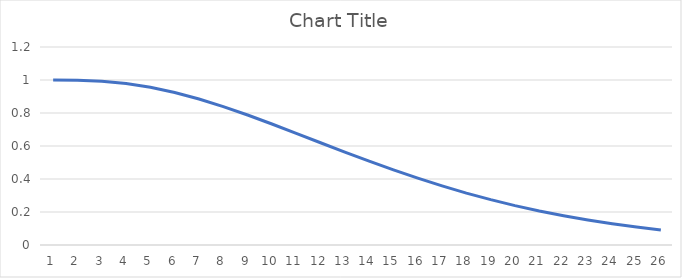
| Category | Series 0 |
|---|---|
| 0 | 1 |
| 1 | 0.999 |
| 2 | 0.993 |
| 3 | 0.979 |
| 4 | 0.956 |
| 5 | 0.925 |
| 6 | 0.885 |
| 7 | 0.839 |
| 8 | 0.788 |
| 9 | 0.733 |
| 10 | 0.677 |
| 11 | 0.62 |
| 12 | 0.563 |
| 13 | 0.508 |
| 14 | 0.455 |
| 15 | 0.405 |
| 16 | 0.358 |
| 17 | 0.315 |
| 18 | 0.275 |
| 19 | 0.239 |
| 20 | 0.206 |
| 21 | 0.177 |
| 22 | 0.151 |
| 23 | 0.128 |
| 24 | 0.109 |
| 25 | 0.091 |